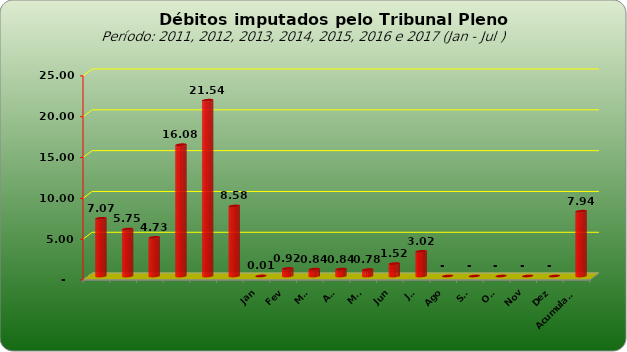
| Category |  7.073.154,74  |
|---|---|
|  | 7073154.74 |
|  | 5749129.25 |
|  | 4727033.51 |
|  | 16081820.48 |
|  | 21535723.6 |
|  | 8578266.09 |
| Jan | 7518 |
| Fev | 924330.96 |
| Mar | 840781.7 |
| Abr | 842058.28 |
| Mai | 780852.82 |
| Jun | 1521029.64 |
| Jul | 3021280.99 |
| Ago | 0 |
| Set | 0 |
| Out | 0 |
| Nov | 0 |
| Dez | 0 |
| Acumulado | 7937852.39 |